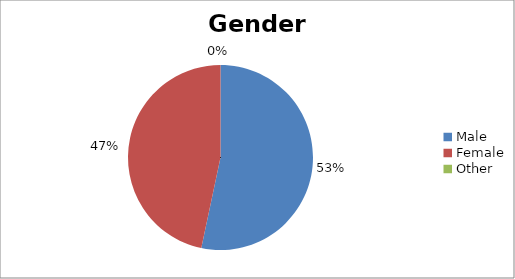
| Category | Gender |
|---|---|
| Male | 8 |
| Female | 7 |
| Other | 0 |